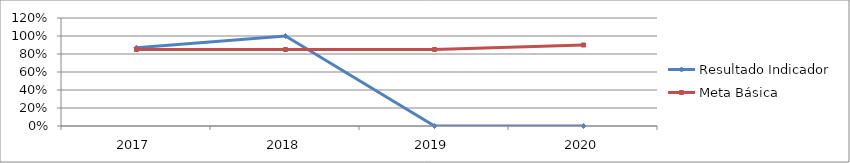
| Category | Resultado Indicador | Meta Básica |
|---|---|---|
| 2017 | 0.87 | 0.85 |
| 2018 | 1 | 0.85 |
| 2019 | 0 | 0.85 |
| 2020 | 0 | 0.9 |